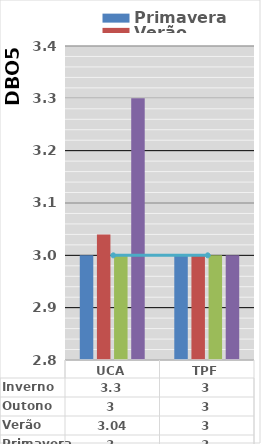
| Category | Primavera | Verão | Outono | Inverno |
|---|---|---|---|---|
| UCA | 3 | 3.04 | 3 | 3.3 |
| TPF | 3 | 3 | 3 | 3 |